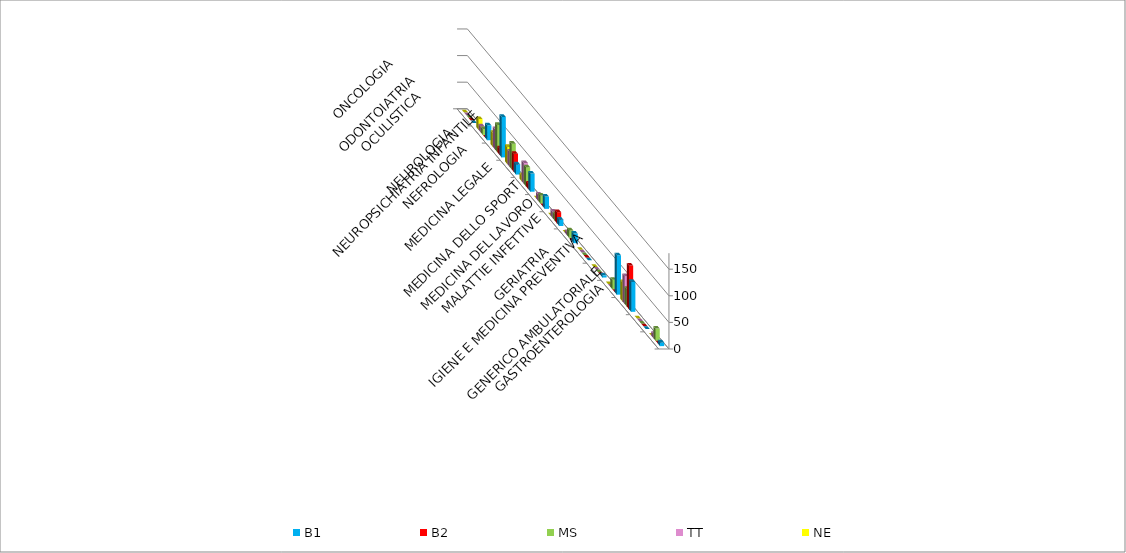
| Category | B1 | B2 | MS | TT | NE |
|---|---|---|---|---|---|
| GASTROENTEROLOGIA | 7 | 0 | 23 | 8 | 0 |
| GENERICO AMBULATORIALE | 0 | 0 | 0 | 0 | 0 |
| GERIATRIA | 56 | 82 | 33 | 52 | 36 |
| IGIENE E MEDICINA PREVENTIVA | 74 | 0 | 18 | 0 | 0 |
| MALATTIE INFETTIVE | 4 | 0 | 0 | 0 | 0 |
| MEDICINA DEL LAVORO | 0 | 0 | 0 | 0 | 0 |
| MEDICINA DELLO SPORT | 18 | 0 | 14 | 6 | 0 |
| MEDICINA LEGALE | 12 | 21 | 12 | 12 | 0 |
| NEFROLOGIA | 23 | 0 | 15 | 12 | 0 |
| NEUROLOGIA | 34 | 10 | 36 | 39 | 11 |
| NEUROPSICHIATRIA INFANTILE | 19 | 34 | 48 | 28 | 32 |
| OCULISTICA | 76 | 12 | 51 | 38 | 26 |
| ODONTOIATRIA | 28 | 0 | 11 | 11 | 20 |
| ONCOLOGIA | 0 | 0 | 0 | 0 | 0 |